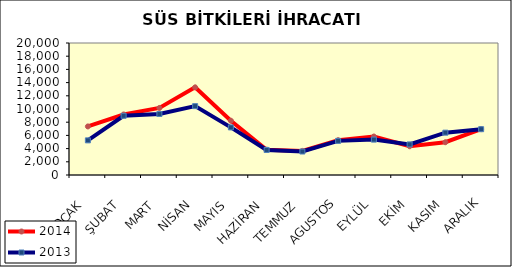
| Category | 2014 | 2013 |
|---|---|---|
| OCAK | 7358.726 | 5248.235 |
| ŞUBAT | 9166.988 | 8969.804 |
| MART | 10157.392 | 9241.514 |
| NİSAN | 13281.129 | 10435.252 |
| MAYIS | 8222.476 | 7212.426 |
| HAZİRAN | 3831.858 | 3794.241 |
| TEMMUZ | 3651.376 | 3556.596 |
| AGUSTOS | 5275.718 | 5171.829 |
| EYLÜL | 5832.938 | 5359.914 |
| EKİM | 4353.962 | 4636.965 |
| KASIM | 4965.075 | 6415.26 |
| ARALIK | 6948.336 | 6939.599 |